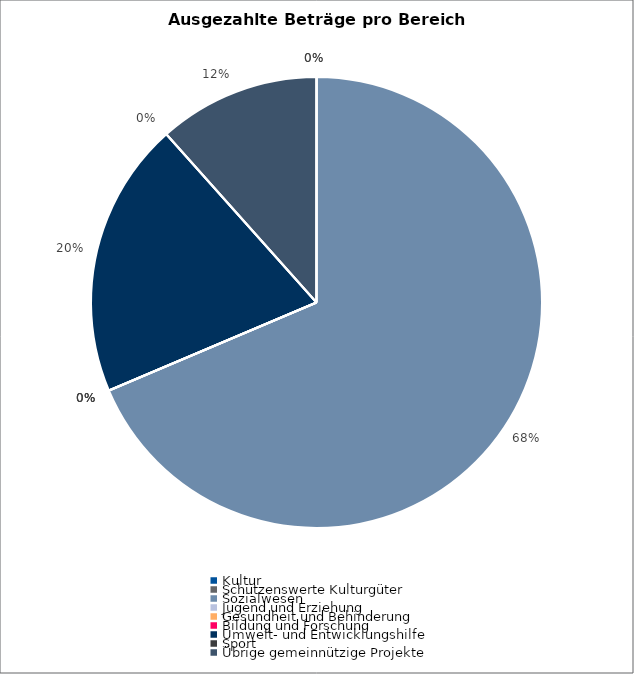
| Category | Series 0 |
|---|---|
| Kultur | 0 |
| Schützenswerte Kulturgüter | 0 |
| Sozialwesen | 319099 |
| Jugend und Erziehung | 0 |
| Gesundheit und Behinderung | 0 |
| Bildung und Forschung | 0 |
| Umwelt- und Entwicklungshilfe | 92000 |
| Sport | 0 |
| Übrige gemeinnützige Projekte | 54000 |